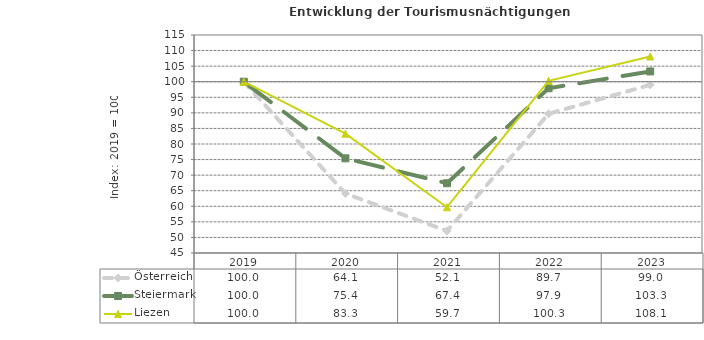
| Category | Österreich | Steiermark | Liezen |
|---|---|---|---|
| 2023.0 | 99 | 103.3 | 108.1 |
| 2022.0 | 89.7 | 97.9 | 100.3 |
| 2021.0 | 52.1 | 67.4 | 59.7 |
| 2020.0 | 64.1 | 75.4 | 83.3 |
| 2019.0 | 100 | 100 | 100 |